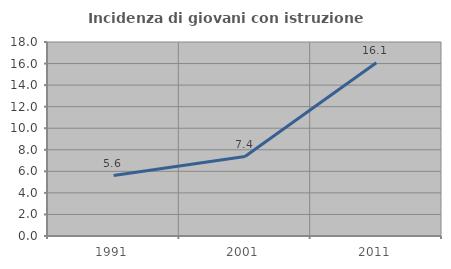
| Category | Incidenza di giovani con istruzione universitaria |
|---|---|
| 1991.0 | 5.607 |
| 2001.0 | 7.372 |
| 2011.0 | 16.078 |